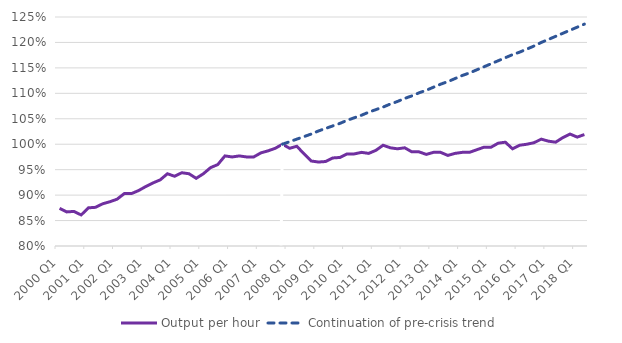
| Category | Output per hour | Continuation of pre-crisis trend |
|---|---|---|
| 2000 Q1 | 87.4 | 0 |
| 2000 Q2 | 86.7 | 0 |
| 2000 Q3 | 86.8 | 0 |
| 2000 Q4 | 86.1 | 0 |
| 2001 Q1 | 87.5 | 0 |
| 2001 Q2 | 87.6 | 0 |
| 2001 Q3 | 88.3 | 0 |
| 2001 Q4 | 88.7 | 0 |
| 2002 Q1 | 89.2 | 0 |
| 2002 Q2 | 90.3 | 0 |
| 2002 Q3 | 90.3 | 0 |
| 2002 Q4 | 90.9 | 0 |
| 2003 Q1 | 91.7 | 0 |
| 2003 Q2 | 92.4 | 0 |
| 2003 Q3 | 93 | 0 |
| 2003 Q4 | 94.2 | 0 |
| 2004 Q1 | 93.7 | 0 |
| 2004 Q2 | 94.4 | 0 |
| 2004 Q3 | 94.2 | 0 |
| 2004 Q4 | 93.3 | 0 |
| 2005 Q1 | 94.2 | 0 |
| 2005 Q2 | 95.4 | 0 |
| 2005 Q3 | 96 | 0 |
| 2005 Q4 | 97.7 | 0 |
| 2006 Q1 | 97.5 | 0 |
| 2006 Q2 | 97.7 | 0 |
| 2006 Q3 | 97.5 | 0 |
| 2006 Q4 | 97.5 | 0 |
| 2007 Q1 | 98.3 | 0 |
| 2007 Q2 | 98.7 | 0 |
| 2007 Q3 | 99.2 | 0 |
| 2007 Q4 | 100 | 100 |
| 2008 Q1 | 99.2 | 100.5 |
| 2008 Q2 | 99.6 | 101 |
| 2008 Q3 | 98.1 | 101.5 |
| 2008 Q4 | 96.7 | 102 |
| 2009 Q1 | 96.5 | 102.6 |
| 2009 Q2 | 96.6 | 103.1 |
| 2009 Q3 | 97.3 | 103.6 |
| 2009 Q4 | 97.4 | 104.1 |
| 2010 Q1 | 98.1 | 104.7 |
| 2010 Q2 | 98.1 | 105.2 |
| 2010 Q3 | 98.4 | 105.7 |
| 2010 Q4 | 98.2 | 106.3 |
| 2011 Q1 | 98.8 | 106.8 |
| 2011 Q2 | 99.8 | 107.3 |
| 2011 Q3 | 99.3 | 107.9 |
| 2011 Q4 | 99.1 | 108.4 |
| 2012 Q1 | 99.3 | 109 |
| 2012 Q2 | 98.5 | 109.5 |
| 2012 Q3 | 98.5 | 110.1 |
| 2012 Q4 | 98 | 110.6 |
| 2013 Q1 | 98.4 | 111.2 |
| 2013 Q2 | 98.4 | 111.8 |
| 2013 Q3 | 97.8 | 112.3 |
| 2013 Q4 | 98.2 | 112.9 |
| 2014 Q1 | 98.4 | 113.5 |
| 2014 Q2 | 98.4 | 114 |
| 2014 Q3 | 98.9 | 114.6 |
| 2014 Q4 | 99.4 | 115.2 |
| 2015 Q1 | 99.4 | 115.8 |
| 2015 Q2 | 100.2 | 116.4 |
| 2015 Q3 | 100.4 | 117 |
| 2015 Q4 | 99.1 | 117.6 |
| 2016 Q1 | 99.8 | 118.1 |
| 2016 Q2 | 100 | 118.7 |
| 2016 Q3 | 100.3 | 119.3 |
| 2016 Q4 | 101 | 120 |
| 2017 Q1 | 100.6 | 120.6 |
| 2017 Q2 | 100.4 | 121.2 |
| 2017 Q3 | 101.3 | 121.8 |
| 2017 Q4 | 102 | 122.4 |
| 2018 Q1 | 101.4 | 123 |
| 2018 Q2 | 101.9 | 123.6 |